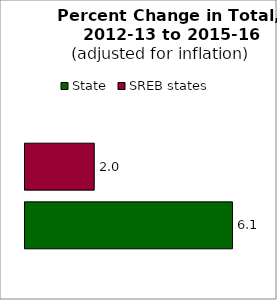
| Category | State | SREB states |
|---|---|---|
| 0 | 6.102 | 2.037 |